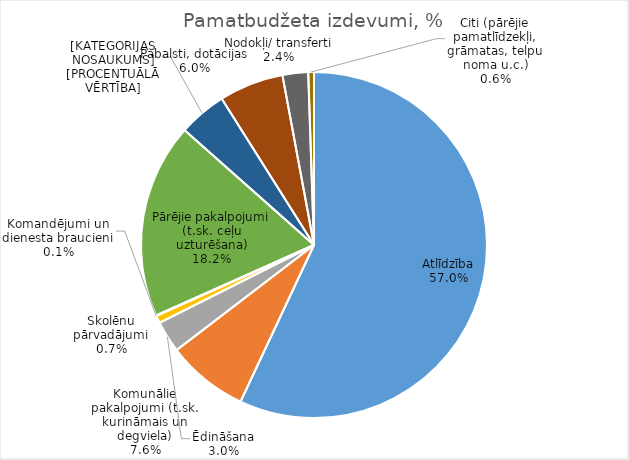
| Category | Series 0 |
|---|---|
| Atlīdzība | 15522626 |
| Komunālie pakalpojumi (t.sk. kurināmais un degviela) | 2078630 |
| Ēdināšana | 808119 |
| Skolēnu pārvadājumi | 187863 |
| Komandējumi un dienesta braucieni | 14861 |
| Pārējie pakalpojumi (t.sk. ceļu uzturēšana) | 4966791 |
| Pārējie materiāli | 1223796 |
| Pabalsti, dotācijas | 1641898 |
| Nodokļi/ transferti | 652326 |
| Citi (pārējie pamatlīdzekļi, grāmatas, telpu noma u.c.) | 145489 |